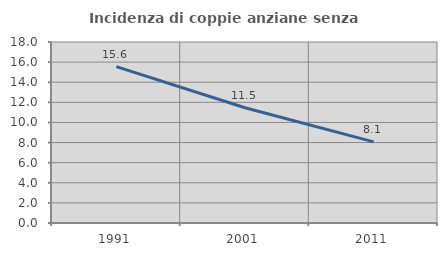
| Category | Incidenza di coppie anziane senza figli  |
|---|---|
| 1991.0 | 15.556 |
| 2001.0 | 11.458 |
| 2011.0 | 8.065 |